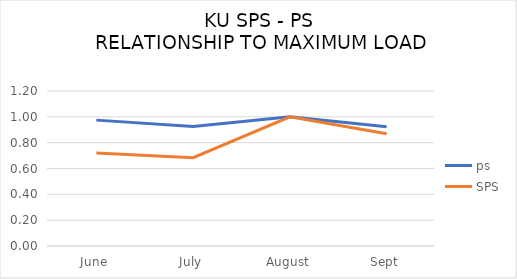
| Category | ps | SPS |
|---|---|---|
| June | 0.975 | 0.72 |
| July | 0.926 | 0.684 |
| August | 1 | 1 |
| Sept | 0.924 | 0.869 |